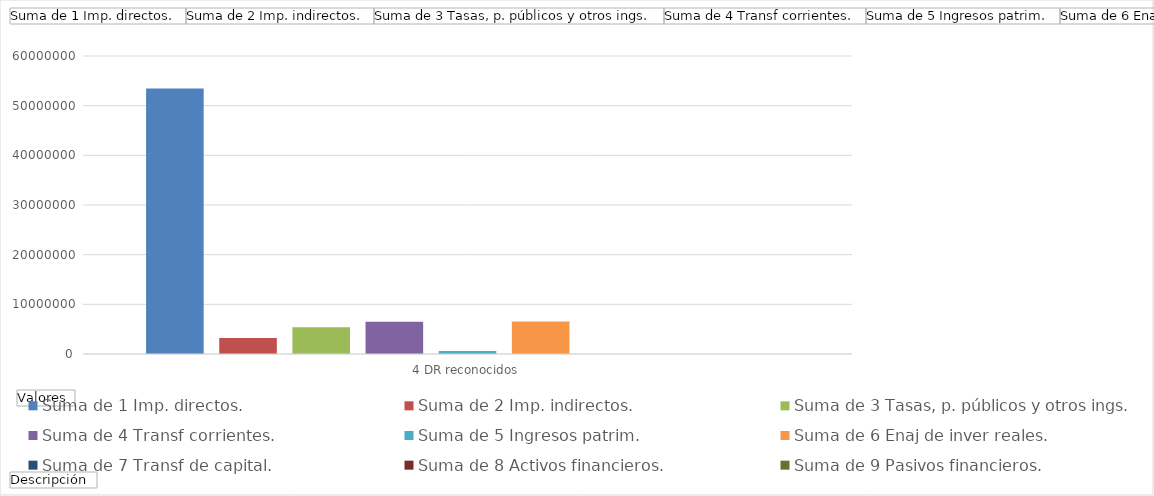
| Category | Suma de 1 Imp. directos. | Suma de 2 Imp. indirectos. | Suma de 3 Tasas, p. públicos y otros ings. | Suma de 4 Transf corrientes. | Suma de 5 Ingresos patrim. | Suma de 6 Enaj de inver reales. | Suma de 7 Transf de capital. | Suma de 8 Activos financieros. | Suma de 9 Pasivos financieros. |
|---|---|---|---|---|---|---|---|---|---|
| 4 DR reconocidos | 53437338.05 | 3229035.84 | 5386473.46 | 6501074.78 | 579172.65 | 6553000 | 0 | 233.4 | 0 |